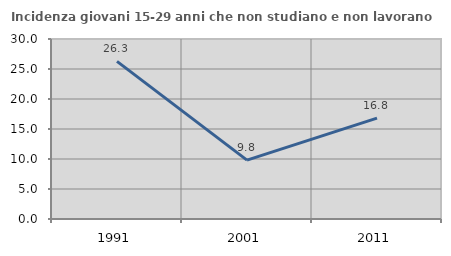
| Category | Incidenza giovani 15-29 anni che non studiano e non lavorano  |
|---|---|
| 1991.0 | 26.277 |
| 2001.0 | 9.816 |
| 2011.0 | 16.822 |